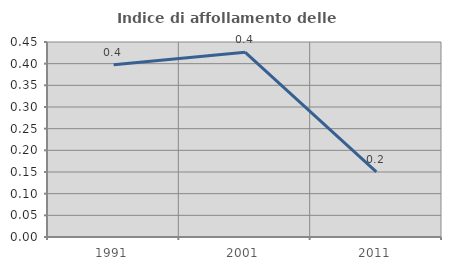
| Category | Indice di affollamento delle abitazioni  |
|---|---|
| 1991.0 | 0.398 |
| 2001.0 | 0.427 |
| 2011.0 | 0.15 |